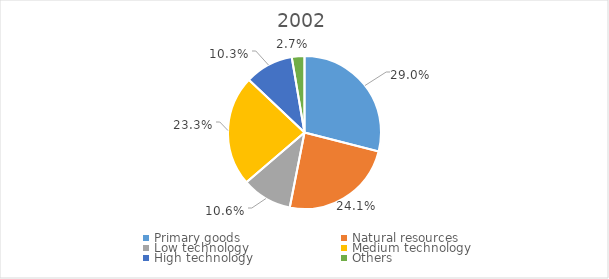
| Category | Series 0 |
|---|---|
| Primary goods | 0.29 |
| Natural resources | 0.241 |
| Low technology | 0.106 |
| Medium technology | 0.233 |
| High technology | 0.103 |
| Others | 0.027 |